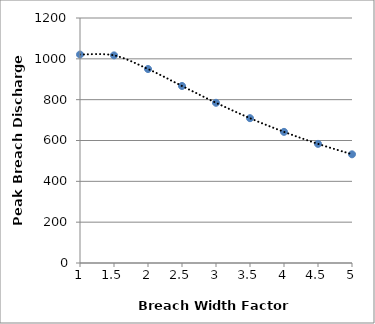
| Category | Series 0 |
|---|---|
| 1.0 | 1020.97 |
| 1.5 | 1016.912 |
| 2.0 | 950.125 |
| 2.5 | 867.026 |
| 3.0 | 784.759 |
| 3.5 | 709.319 |
| 4.0 | 642.294 |
| 4.5 | 583.547 |
| 5.0 | 532.316 |